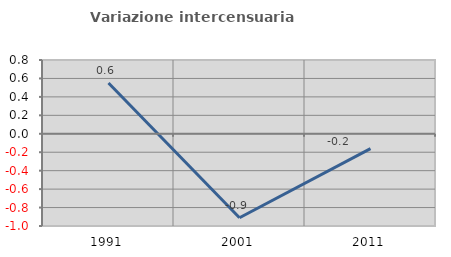
| Category | Variazione intercensuaria annua |
|---|---|
| 1991.0 | 0.55 |
| 2001.0 | -0.91 |
| 2011.0 | -0.161 |